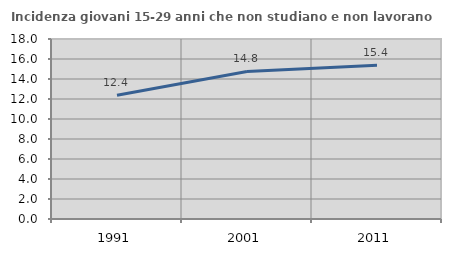
| Category | Incidenza giovani 15-29 anni che non studiano e non lavorano  |
|---|---|
| 1991.0 | 12.366 |
| 2001.0 | 14.758 |
| 2011.0 | 15.385 |